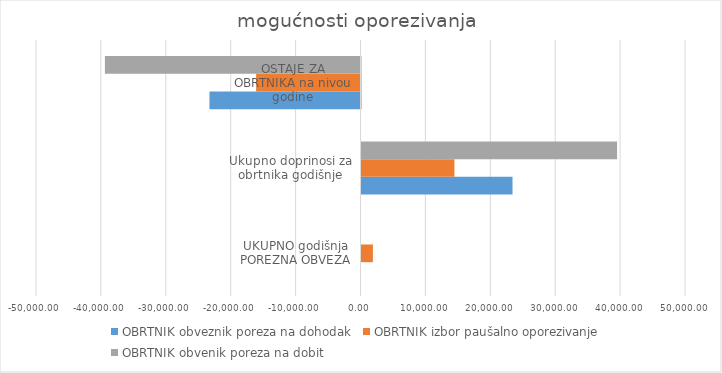
| Category | OBRTNIK obveznik poreza na dohodak | OBRTNIK izbor paušalno oporezivanje | OBRTNIK obvenik poreza na dobit |
|---|---|---|---|
| UKUPNO godišnja POREZNA OBVEZA | 0 | 1759.5 | 0 |
| Ukupno doprinosi za obrtnika godišnje | 23270.832 | 14320.512 | 39381.408 |
| OSTAJE ZA OBRTNIKA na nivou godine | -23270.832 | -16080.012 | -39381.408 |